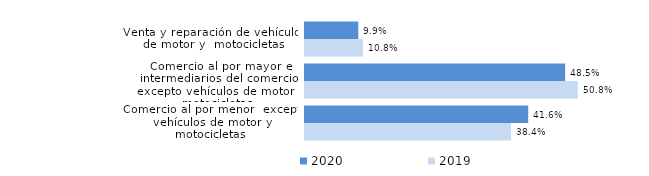
| Category | 2020 | 2019 |
|---|---|---|
| Venta y reparación de vehículos de motor y  motocicletas | 0.099 | 0.108 |
| Comercio al por mayor e intermediarios del comercio, excepto vehículos de motor y motocicletas | 0.485 | 0.508 |
| Comercio al por menor  excepto vehículos de motor y motocicletas | 0.416 | 0.384 |